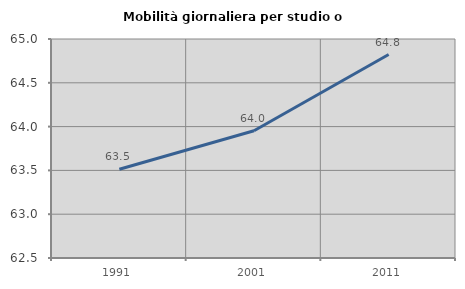
| Category | Mobilità giornaliera per studio o lavoro |
|---|---|
| 1991.0 | 63.512 |
| 2001.0 | 63.953 |
| 2011.0 | 64.823 |